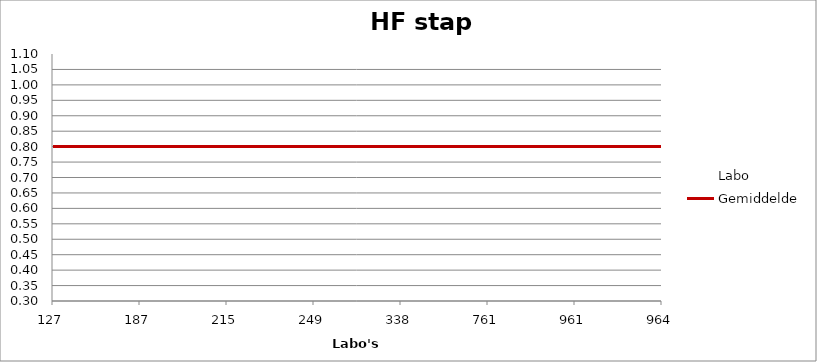
| Category | Labo | Gemiddelde |
|---|---|---|
| 127.0 | 0.998 | 0.8 |
| 187.0 | 0.8 | 0.8 |
| 215.0 | 0.901 | 0.8 |
| 249.0 | 0.356 | 0.8 |
| 338.0 | 0.802 | 0.8 |
| 761.0 | 0.823 | 0.8 |
| 961.0 | 0.739 | 0.8 |
| 964.0 | 0.872 | 0.8 |